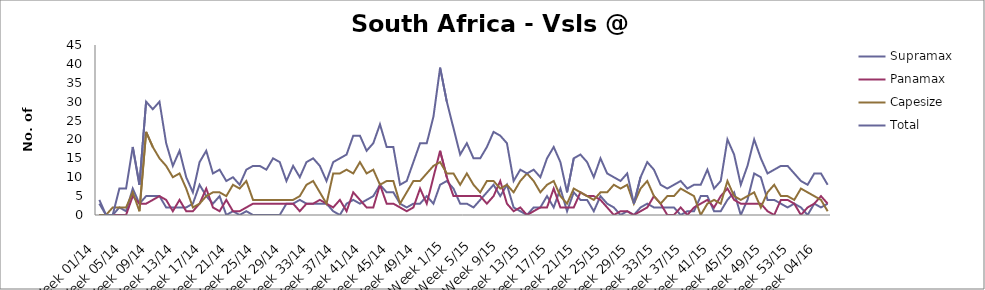
| Category | Supramax | Panamax | Capesize | Total |
|---|---|---|---|---|
| Week 01/14 | 3 | 0 | 0 | 4 |
| Week 02/14 | 0 | 0 | 0 | 0 |
| Week 03/14 | 0 | 0 | 2 | 0 |
| Week 04/14 | 2 | 0 | 2 | 7 |
| Week 05/14 | 1 | 0 | 2 | 7 |
| Week 06/14 | 7 | 5 | 6 | 18 |
| Week 07/14 | 3 | 3 | 1 | 8 |
| Week 08/14 | 5 | 3 | 22 | 30 |
| Week 09/14 | 5 | 4 | 18 | 28 |
| Week 10/14 | 5 | 5 | 15 | 30 |
| Week 11/14 | 2 | 4 | 13 | 19 |
| Week 12/14 | 2 | 1 | 10 | 13 |
| Week 13/14 | 2 | 4 | 11 | 17 |
| Week 14/14 | 2 | 1 | 7 | 10 |
| Week 15/14 | 3 | 1 | 2 | 6 |
| Week 16/14 | 8 | 3 | 3 | 14 |
| Week 17/14 | 5 | 7 | 5 | 17 |
| Week 18/14 | 3 | 2 | 6 | 11 |
| Week 19/14 | 5 | 1 | 6 | 12 |
| Week 20/14 | 0 | 4 | 5 | 9 |
| Week 21/14 | 1 | 1 | 8 | 10 |
| Week 22/14 | 0 | 1 | 7 | 8 |
| Week 23/14 | 1 | 2 | 9 | 12 |
| Week 24/14 | 0 | 3 | 4 | 13 |
| Week 25/14 | 0 | 3 | 4 | 13 |
| Week 26/14 | 0 | 3 | 4 | 12 |
| Week 27/14 | 0 | 3 | 4 | 15 |
| Week 28/14 | 0 | 3 | 4 | 14 |
| Week 29/14 | 3 | 3 | 4 | 9 |
| Week 30/14 | 3 | 3 | 4 | 13 |
| Week 31/14 | 4 | 1 | 5 | 10 |
| Week 32/14 | 3 | 3 | 8 | 14 |
| Week 33/14 | 3 | 3 | 9 | 15 |
| Week 34/14 | 3 | 4 | 6 | 13 |
| Week 35/14 | 3 | 3 | 3 | 9 |
| Week 36/14 | 1 | 2 | 11 | 14 |
| Week 37/14 | 0 | 4 | 11 | 15 |
| Week 38/14 | 3 | 1 | 12 | 16 |
| Week 39/14 | 4 | 6 | 11 | 21 |
| Week 40/14 | 3 | 4 | 14 | 21 |
| Week 41/14 | 4 | 2 | 11 | 17 |
| Week 42/14 | 5 | 2 | 12 | 19 |
| Week 43/14 | 8 | 8 | 8 | 24 |
| Week 44/14 | 6 | 3 | 9 | 18 |
| Week 45/14 | 6 | 3 | 9 | 18 |
| Week 46/14 | 3 | 2 | 3 | 8 |
| Week 47/14 | 2 | 1 | 6 | 9 |
| Week 48/14 | 3 | 2 | 9 | 14 |
| Week 49/14 | 3 | 7 | 9 | 19 |
| Week 50/14 | 5 | 3 | 11 | 19 |
| Week 51/14 | 3 | 10 | 13 | 26 |
| Week 52/14 | 8 | 17 | 14 | 39 |
| Week 1/15 | 9 | 10 | 11 | 30 |
| Week 2/15 | 7 | 5 | 11 | 23 |
| Week 3/15 | 3 | 5 | 8 | 16 |
| Week 4/15 | 3 | 5 | 11 | 19 |
| Week 5/15 | 2 | 5 | 8 | 15 |
| Week 6/15 | 4 | 5 | 6 | 15 |
| Week 7/15 | 6 | 3 | 9 | 18 |
| Week 8/15 | 8 | 5 | 9 | 22 |
| Week 9/15 | 5 | 9 | 7 | 21 |
| Week 10/15 | 8 | 3 | 8 | 19 |
| Week 11/15 | 2 | 1 | 6 | 9 |
| Week 12/15 | 1 | 2 | 9 | 12 |
| Week 13/15 | 0 | 0 | 11 | 11 |
| Week 14/15 | 2 | 1 | 9 | 12 |
| Week 15/15 | 2 | 2 | 6 | 10 |
| Week 16/15 | 5 | 2 | 8 | 15 |
| Week 17/15 | 2 | 7 | 9 | 18 |
| Week 18/15 | 7 | 2 | 5 | 14 |
| Week 19/15 | 1 | 2 | 3 | 6 |
| Week 20/15 | 6 | 2 | 7 | 15 |
| Week 21/15 | 4 | 6 | 6 | 16 |
| Week 22/15 | 4 | 5 | 5 | 14 |
| Week 23/15 | 1 | 5 | 4 | 10 |
| Week 24/15 | 5 | 4 | 6 | 15 |
| Week 25/15 | 3 | 2 | 6 | 11 |
| Week 26/15 | 2 | 0 | 8 | 10 |
| Week 27/15 | 0 | 1 | 7 | 9 |
| Week 28/15 | 1 | 1 | 8 | 11 |
| Week 29/15 | 0 | 0 | 3 | 3 |
| Week 30/15 | 2 | 1 | 7 | 10 |
| Week 31/15 | 3 | 2 | 9 | 14 |
| Week 32/15 | 2 | 5 | 5 | 12 |
| Week 33/15 | 2 | 3 | 3 | 8 |
| Week 34/15 | 2 | 0 | 5 | 7 |
| Week 35/15 | 2 | 0 | 5 | 8 |
| Week 36/15 | 0 | 2 | 7 | 9 |
| Week 37/15 | 1 | 0 | 6 | 7 |
| Week 38/15 | 1 | 2 | 5 | 8 |
| Week 39/15 | 5 | 3 | 0 | 8 |
| Week 40/15 | 5 | 4 | 3 | 12 |
| Week 41/15 | 1 | 2 | 4 | 7 |
| Week 42/15 | 1 | 5 | 3 | 9 |
| Week 43/15 | 4 | 7 | 9 | 20 |
| Week 44/15 | 6 | 4 | 5 | 16 |
| Week 45/15 | 0 | 3 | 4 | 8 |
| Week 46/15 | 4 | 3 | 5 | 13 |
| Week 47/15 | 11 | 3 | 6 | 20 |
| Week 48/15 | 10 | 3 | 2 | 15 |
| Week 49/15 | 4 | 1 | 6 | 11 |
| Week 50/15 | 4 | 0 | 8 | 12 |
| Week 51/15 | 3 | 4 | 5 | 13 |
| Week 52/15 | 2 | 4 | 5 | 13 |
| Week 53/15 | 3 | 3 | 4 | 11 |
| Week 01/16 | 2 | 0 | 7 | 9 |
| Week 02/16 | 0 | 2 | 6 | 8 |
| Week 03/16 | 3 | 3 | 5 | 11 |
| Week 04/16 | 2 | 5 | 4 | 11 |
| Week 05/16 | 3 | 3 | 1 | 8 |